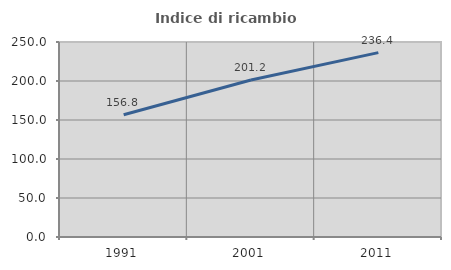
| Category | Indice di ricambio occupazionale  |
|---|---|
| 1991.0 | 156.79 |
| 2001.0 | 201.19 |
| 2011.0 | 236.364 |